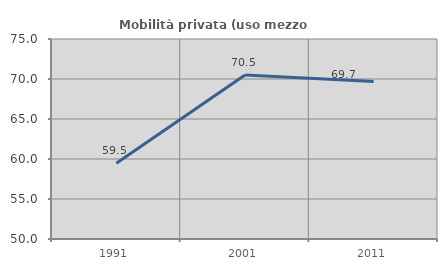
| Category | Mobilità privata (uso mezzo privato) |
|---|---|
| 1991.0 | 59.463 |
| 2001.0 | 70.508 |
| 2011.0 | 69.675 |